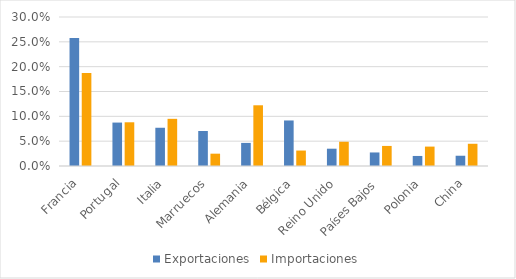
| Category | Exportaciones | Importaciones |
|---|---|---|
| Francia | 0.258 | 0.187 |
| Portugal | 0.087 | 0.088 |
| Italia | 0.077 | 0.095 |
| Marruecos | 0.071 | 0.025 |
| Alemania | 0.047 | 0.122 |
| Bélgica | 0.092 | 0.031 |
| Reino Unido | 0.035 | 0.049 |
| Países Bajos | 0.027 | 0.04 |
| Polonia | 0.02 | 0.039 |
| China | 0.021 | 0.045 |